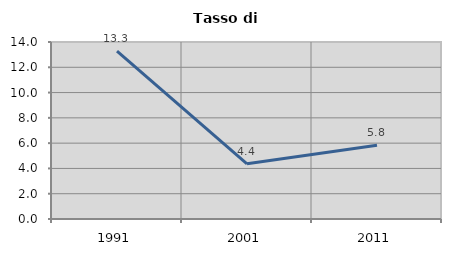
| Category | Tasso di disoccupazione   |
|---|---|
| 1991.0 | 13.282 |
| 2001.0 | 4.367 |
| 2011.0 | 5.829 |